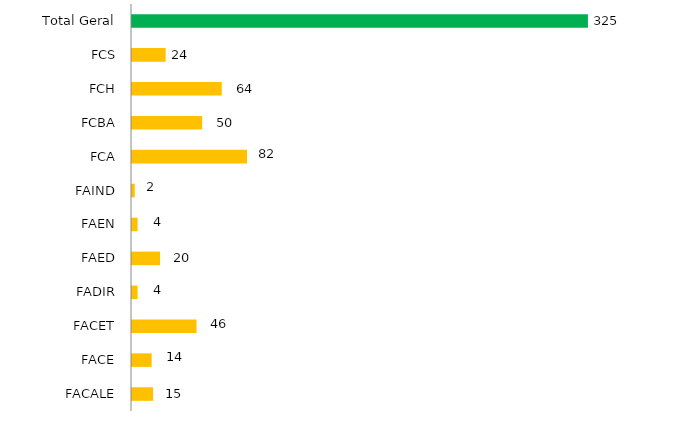
| Category | Faculdade/mês |
|---|---|
| FACALE | 15 |
| FACE | 14 |
| FACET | 46 |
| FADIR | 4 |
| FAED | 20 |
| FAEN | 4 |
| FAIND | 2 |
| FCA | 82 |
| FCBA | 50 |
| FCH | 64 |
| FCS | 24 |
| Total Geral | 325 |